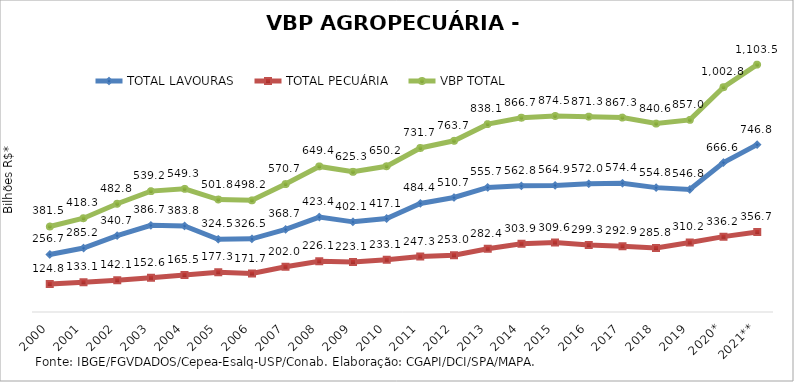
| Category | TOTAL LAVOURAS | TOTAL PECUÁRIA | VBP TOTAL |
|---|---|---|---|
| 2000 | 256.741 | 124.799 | 381.541 |
| 2001 | 285.192 | 133.145 | 418.337 |
| 2002 | 340.672 | 142.133 | 482.805 |
| 2003 | 386.66 | 152.555 | 539.215 |
| 2004 | 383.829 | 165.479 | 549.308 |
| 2005 | 324.51 | 177.268 | 501.778 |
| 2006 | 326.493 | 171.686 | 498.179 |
| 2007 | 368.714 | 201.979 | 570.693 |
| 2008 | 423.375 | 226.063 | 649.438 |
| 2009 | 402.15 | 223.123 | 625.273 |
| 2010 | 417.074 | 233.12 | 650.194 |
| 2011 | 484.38 | 247.281 | 731.66 |
| 2012 | 510.72 | 252.953 | 763.673 |
| 2013 | 555.666 | 282.392 | 838.058 |
| 2014 | 562.816 | 303.934 | 866.75 |
| 2015 | 564.858 | 309.626 | 874.483 |
| 2016 | 572 | 299.331 | 871.331 |
| 2017 | 574.375 | 292.899 | 867.274 |
| 2018 | 554.814 | 285.815 | 840.63 |
| 2019 | 546.836 | 310.192 | 857.027 |
| 2020* | 666.605 | 336.228 | 1002.833 |
| 2021** | 746.817 | 356.707 | 1103.525 |